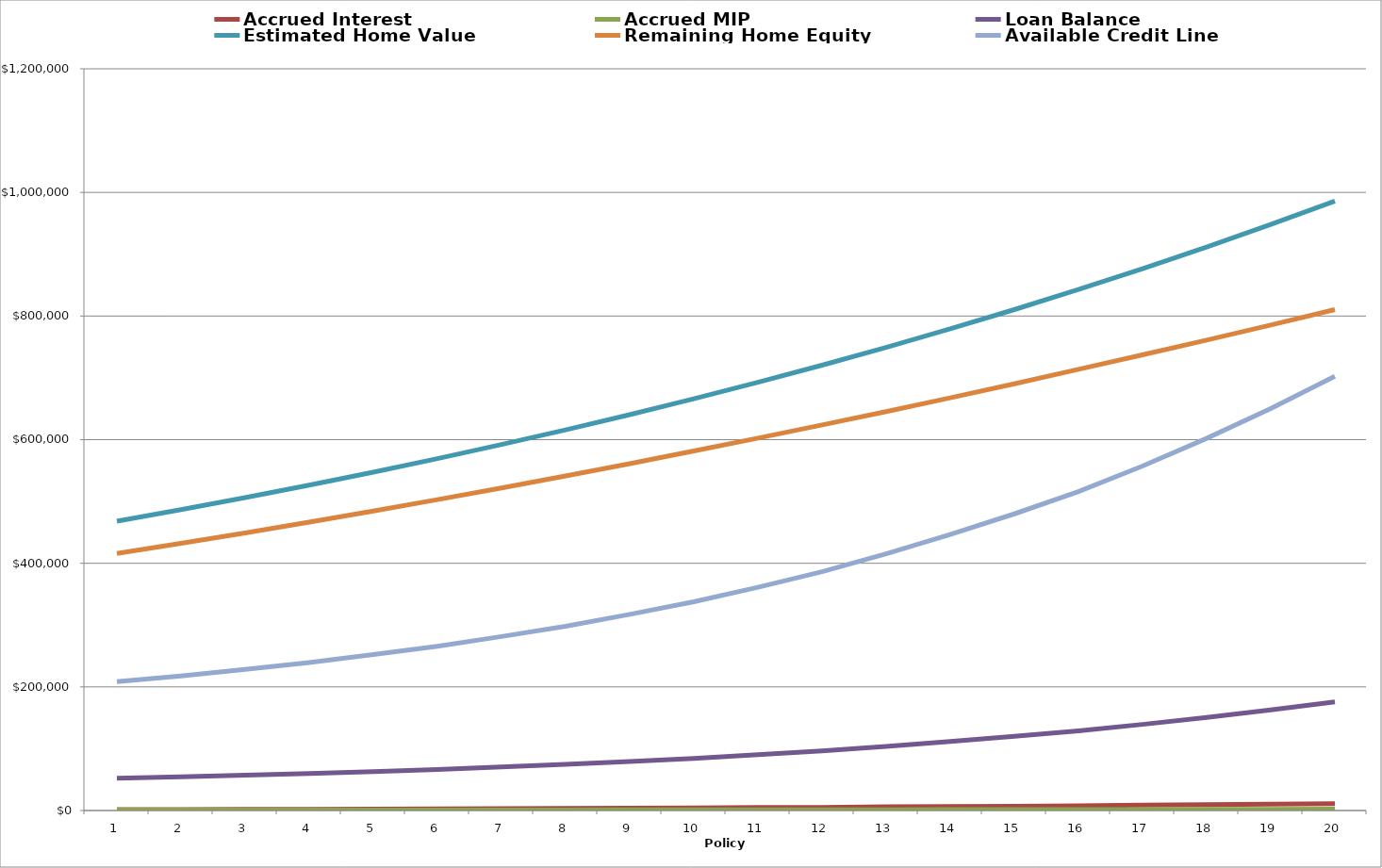
| Category | Accrued Interest | Accrued MIP | Loan Balance | Estimated Home Value | Remaining Home Equity | Available Credit Line |
|---|---|---|---|---|---|---|
| 1.0 | 1529.566 | 637.319 | 52166.886 | 468000 | 415833.114 | 208667.543 |
| 2.0 | 1595.854 | 664.939 | 54427.68 | 486720 | 432292.32 | 217710.718 |
| 3.0 | 1946.994 | 695.355 | 57070.028 | 506188.8 | 449118.772 | 228280.112 |
| 4.0 | 2041.516 | 729.113 | 59840.657 | 526436.352 | 466595.695 | 239362.628 |
| 5.0 | 2452.071 | 766.272 | 63059 | 547493.806 | 484434.806 | 252236.002 |
| 6.0 | 2583.948 | 807.484 | 66450.432 | 569393.558 | 502943.126 | 265801.73 |
| 7.0 | 3070.348 | 852.874 | 70373.655 | 592169.301 | 521795.646 | 281494.619 |
| 8.0 | 3251.621 | 903.228 | 74528.503 | 615856.073 | 541327.569 | 298114.014 |
| 9.0 | 3835.047 | 958.762 | 79322.312 | 640490.316 | 561168.004 | 317289.248 |
| 10.0 | 4081.724 | 1020.431 | 84424.467 | 666109.928 | 581685.461 | 337697.868 |
| 11.0 | 4789.727 | 1088.574 | 90302.769 | 692754.325 | 602451.557 | 361211.074 |
| 12.0 | 5123.226 | 1164.37 | 96590.364 | 720464.498 | 623874.134 | 386361.456 |
| 13.0 | 5991.93 | 1248.319 | 103830.613 | 749283.078 | 645452.465 | 415322.453 |
| 14.0 | 6441.075 | 1341.891 | 111613.579 | 779254.401 | 667640.822 | 446454.317 |
| 15.0 | 6923.887 | 1442.477 | 119979.943 | 810424.577 | 690444.634 | 479919.772 |
| 16.0 | 7442.89 | 1550.602 | 128973.435 | 842841.561 | 713868.125 | 515893.741 |
| 17.0 | 8687.559 | 1670.684 | 139331.679 | 876555.223 | 737223.544 | 557326.714 |
| 18.0 | 9385.283 | 1804.862 | 150521.823 | 911617.432 | 761095.609 | 602087.293 |
| 19.0 | 10139.043 | 1949.816 | 162610.682 | 948082.129 | 785471.447 | 650442.729 |
| 20.0 | 10953.34 | 2106.412 | 175670.434 | 986005.414 | 810334.981 | 702681.734 |